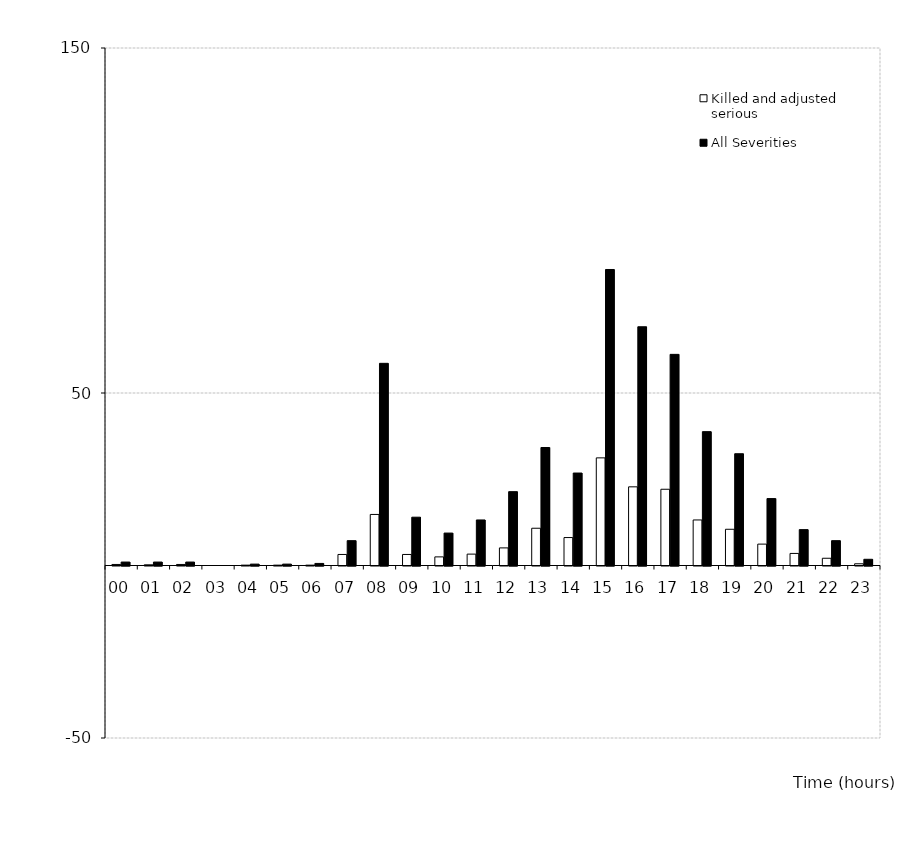
| Category | Killed and adjusted serious | All Severities |
|---|---|---|
| 00 | 0.3 | 1 |
| 01 | 0.2 | 1 |
| 02 | 0.3 | 1 |
| 03 | 0 | 0 |
| 04 | 0.1 | 0.4 |
| 05 | 0.1 | 0.4 |
| 06 | 0.1 | 0.6 |
| 07 | 3.2 | 7.2 |
| 08 | 14.8 | 58.6 |
| 09 | 3.2 | 14 |
| 10 | 2.5 | 9.4 |
| 11 | 3.3 | 13.2 |
| 12 | 5.1 | 21.4 |
| 13 | 10.8 | 34.2 |
| 14 | 8.1 | 26.8 |
| 15 | 31.2 | 85.8 |
| 16 | 22.8 | 69.2 |
| 17 | 22.1 | 61.2 |
| 18 | 13.2 | 38.8 |
| 19 | 10.5 | 32.4 |
| 20 | 6.2 | 19.4 |
| 21 | 3.5 | 10.4 |
| 22 | 2.1 | 7.2 |
| 23 | 0.5 | 1.8 |